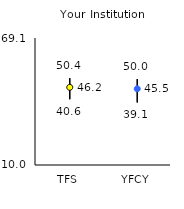
| Category | 25th | 75th | Mean |
|---|---|---|---|
| TFS | 40.6 | 50.4 | 46.15 |
| YFCY | 39.1 | 50 | 45.47 |